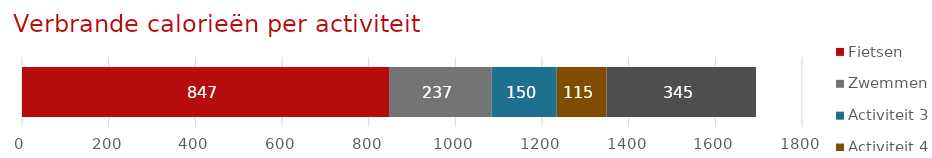
| Category | Fietsen | Zwemmen | Activiteit 3 | Activiteit 4 | Activiteit 5 |
|---|---|---|---|---|---|
| Activiteitenlogboek | 847 | 237 | 150 | 115 | 345 |